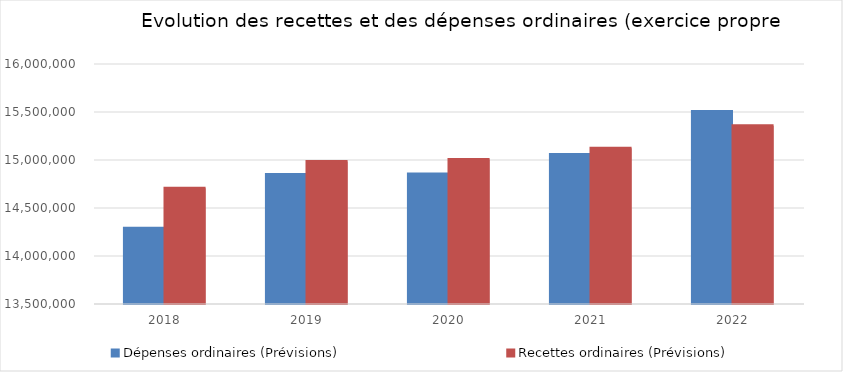
| Category | Dépenses ordinaires (Prévisions) | Recettes ordinaires (Prévisions) |
|---|---|---|
| 2018.0 | 14289594.96 | 14704872.84 |
| 2019.0 | 14848443.15 | 14985566.17 |
| 2020.0 | 14854821.65 | 15004185.49 |
| 2021.0 | 15057822.14 | 15122076.29 |
| 2022.0 | 15505900.38 | 15357327.63 |